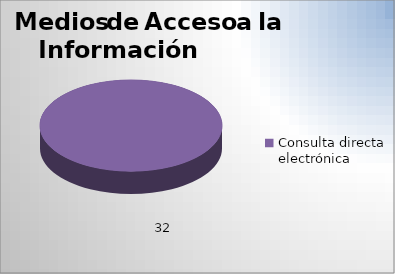
| Category | Series 0 |
|---|---|
| Consulta directa electrónica | 32 |